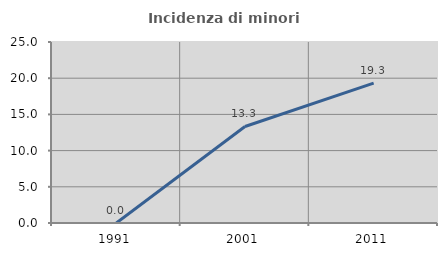
| Category | Incidenza di minori stranieri |
|---|---|
| 1991.0 | 0 |
| 2001.0 | 13.333 |
| 2011.0 | 19.318 |